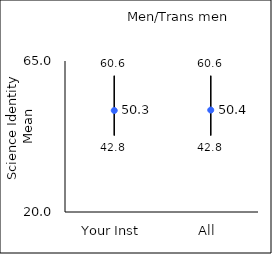
| Category | 25th percentile | 75th percentile | Mean |
|---|---|---|---|
| Your Inst | 42.8 | 60.6 | 50.25 |
| All  | 42.8 | 60.6 | 50.38 |